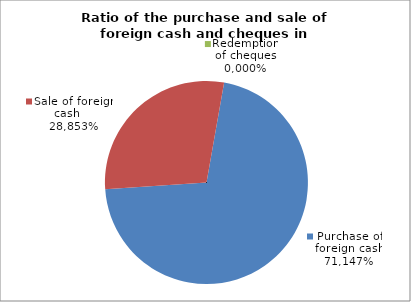
| Category | Purchase of foreign cash |
|---|---|
| 0 | 0.711 |
| 1 | 0.289 |
| 2 | 0 |